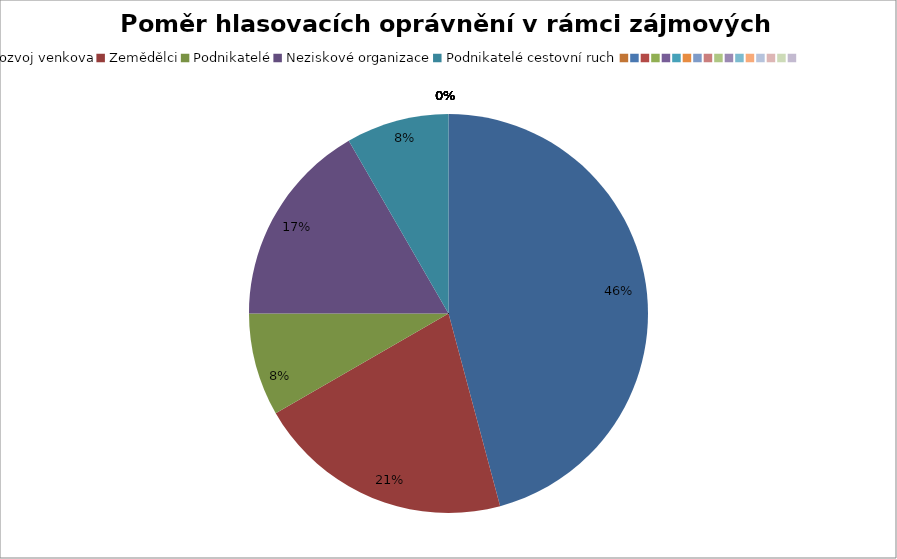
| Category | Series 0 |
|---|---|
| Rozvoj venkova | 0.458 |
| Zemědělci | 0.208 |
| Podnikatelé | 0.083 |
| Neziskové organizace | 0.167 |
| Podnikatelé cestovní ruch | 0.083 |